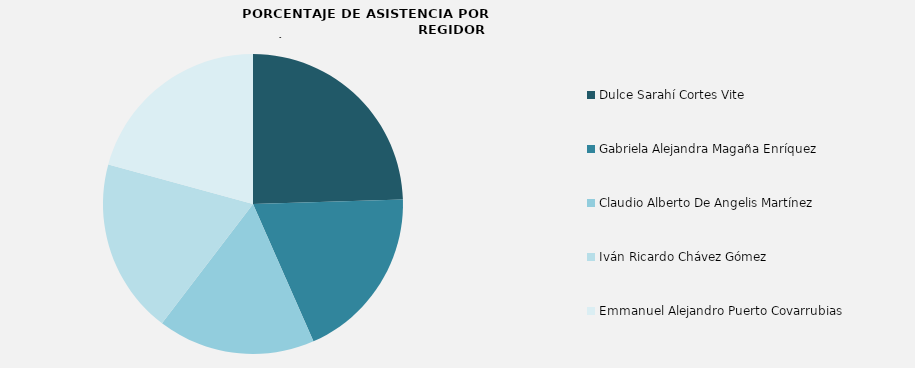
| Category | Series 0 |
|---|---|
| Dulce Sarahí Cortes Vite  | 100 |
| Gabriela Alejandra Magaña Enríquez | 76.923 |
| Claudio Alberto De Angelis Martínez | 69.231 |
| Iván Ricardo Chávez Gómez | 76.923 |
| Emmanuel Alejandro Puerto Covarrubias | 84.615 |